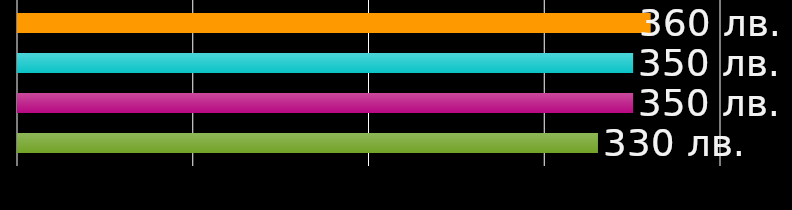
| Category | съквартирант 1 | съквартирант 2 | съквартирант 3 | съквартирант 4 |
|---|---|---|---|---|
| 0 | 360 | 350 | 350 | 330 |